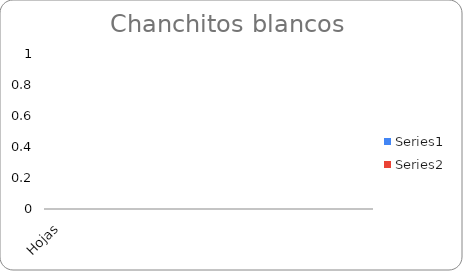
| Category | Series 0 | Series 1 |
|---|---|---|
| Hojas | 0 | 0 |